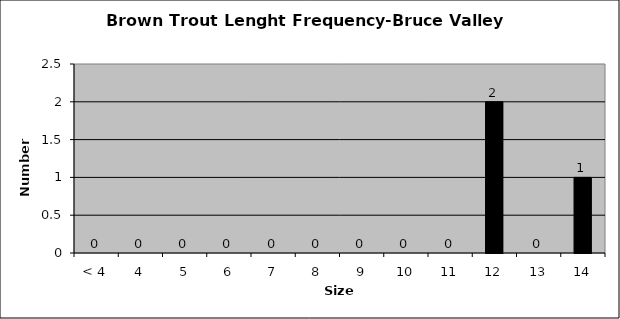
| Category | Series 0 |
|---|---|
| < 4 | 0 |
| 4 | 0 |
| 5 | 0 |
| 6 | 0 |
| 7 | 0 |
| 8 | 0 |
| 9 | 0 |
| 10 | 0 |
| 11 | 0 |
| 12 | 2 |
| 13 | 0 |
| 14 | 1 |